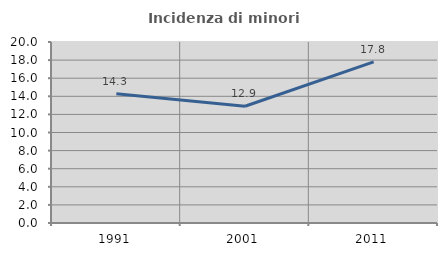
| Category | Incidenza di minori stranieri |
|---|---|
| 1991.0 | 14.286 |
| 2001.0 | 12.903 |
| 2011.0 | 17.797 |